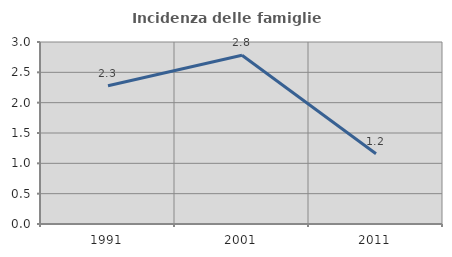
| Category | Incidenza delle famiglie numerose |
|---|---|
| 1991.0 | 2.278 |
| 2001.0 | 2.782 |
| 2011.0 | 1.158 |